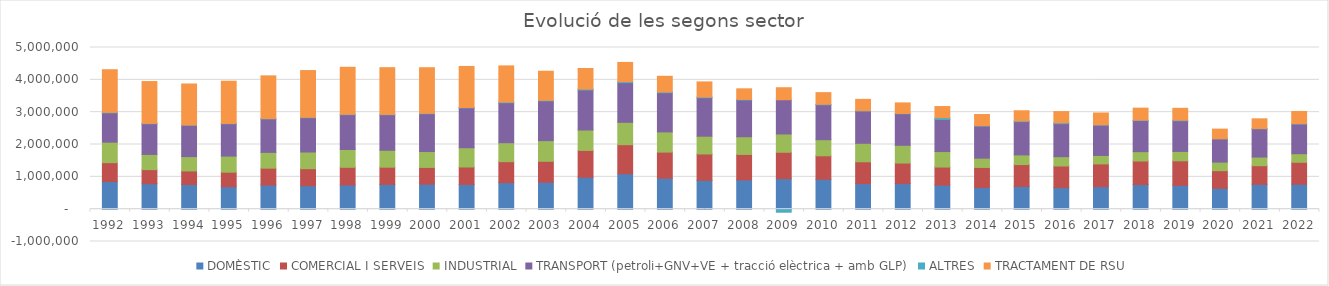
| Category | DOMÈSTIC | COMERCIAL I SERVEIS | INDUSTRIAL | TRANSPORT (petroli+GNV+VE + tracció elèctrica + amb GLP) | ALTRES | TRACTAMENT DE RSU |
|---|---|---|---|---|---|---|
| 1992.0 | 854528.059 | 584212.26 | 632091.898 | 906853.51 | 15305.929 | 1320011 |
| 1993.0 | 785992.557 | 436707.334 | 470454.657 | 948949.878 | 10306.67 | 1294547 |
| 1994.0 | 762505.096 | 419968.6 | 443567.355 | 969840.033 | 6911.299 | 1268800 |
| 1995.0 | 693358.303 | 450563.642 | 497480.189 | 999492.598 | 9934.119 | 1306784 |
| 1996.0 | 745179.108 | 523247.712 | 487372.572 | 1034208.745 | 12242.729 | 1320572 |
| 1997.0 | 726292.596 | 525715.998 | 515354.941 | 1061028.811 | 12394.495 | 1445978 |
| 1998.0 | 747272.378 | 547430.724 | 550491.875 | 1077613.419 | 10934.557 | 1455093 |
| 1999.0 | 766445.423 | 531276.388 | 523244.643 | 1098751.83 | 10450.794 | 1446397.72 |
| 2000.0 | 772852.073 | 518439.704 | 490840.692 | 1169627.985 | 11608.094 | 1410944.716 |
| 2001.0 | 765097.758 | 539378.57 | 595210.167 | 1232808.835 | 11912.258 | 1269566.631 |
| 2002.0 | 820196.306 | 649736.805 | 584905.108 | 1237222.283 | 18266.131 | 1121085.87 |
| 2003.0 | 831800.512 | 649600.012 | 637606.52 | 1230071.767 | 17396.947 | 898854.907 |
| 2004.0 | 987004.108 | 829815.398 | 631015.756 | 1238286.455 | 27357.046 | 636280.504 |
| 2005.0 | 1094930.343 | 899866.147 | 691009.137 | 1226707.318 | 31462.471 | 594467.739 |
| 2006.0 | 957783.415 | 807278.393 | 624856.793 | 1211246.495 | 21549.093 | 486452.736 |
| 2007.0 | 889856.435 | 817463.8 | 548996.689 | 1189824.263 | 20194.041 | 469746.215 |
| 2008.0 | 905369.507 | 787425.058 | 547136.169 | 1138230.741 | 16066.217 | 327580 |
| 2009.0 | 942206.959 | 817901.471 | 564995.441 | 1058977.341 | -94546.91 | 371720.614 |
| 2010.0 | 925419.217 | 725134.309 | 498766.379 | 1080531.648 | 14969.319 | 359526.81 |
| 2011.0 | 789057.239 | 676824.179 | 571255.768 | 1000344.466 | 8993.326 | 349051.664 |
| 2012.0 | 791410.754 | 634066.377 | 549476.389 | 976268.892 | 7808.579 | 327567.587 |
| 2013.0 | 742320.442 | 560036.148 | 479230.456 | 991876.289 | 56201.53 | 344057.968 |
| 2014.0 | 669640.376 | 620949.577 | 287298.024 | 996432.779 | 6515.419 | 346109.682 |
| 2015.0 | 701583.188 | 678519.393 | 297968.624 | 1030769.535 | 18757.469 | 316184.449 |
| 2016.0 | 664664.078 | 669739.746 | 289056.287 | 1021519.197 | 26363.125 | 346789.202 |
| 2017.0 | 696469.024 | 702912.346 | 261847.27 | 935464.475 | 13525.214 | 364237.835 |
| 2018.0 | 761148.527 | 728891.081 | 288442.715 | 962569.546 | 13461.444 | 370157.177 |
| 2019.0 | 736330.362 | 759805.986 | 289120.893 | 949629.424 | 17568.525 | 366160.315 |
| 2020.0 | 645498.564 | 544502.509 | 265159.129 | 719728.499 | 3463.364 | 297054.775 |
| 2021.0 | 767572 | 576392 | 267670 | 874027 | 7870 | 300301 |
| 2022.0 | 771623 | 678216 | 265384 | 918551 | 10189 | 377654 |